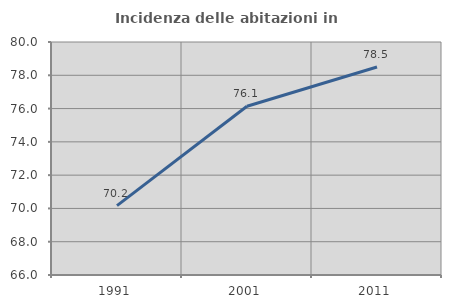
| Category | Incidenza delle abitazioni in proprietà  |
|---|---|
| 1991.0 | 70.167 |
| 2001.0 | 76.143 |
| 2011.0 | 78.5 |